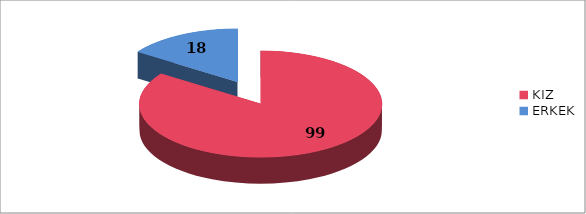
| Category | Series 0 |
|---|---|
| KIZ | 99 |
| ERKEK | 18 |